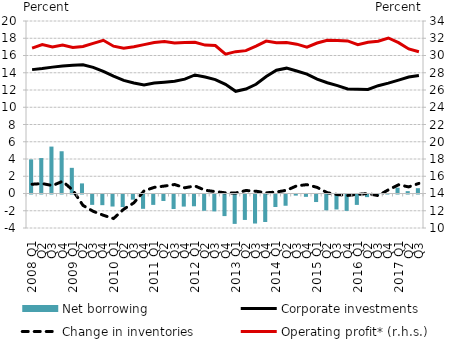
| Category | Net borrowing |
|---|---|
| 2008 Q1 | 3.953 |
| Q2 | 4.111 |
| Q3 | 5.439 |
| Q4 | 4.897 |
| 2009 Q1 | 2.976 |
| Q2 | 1.172 |
| Q3 | -1.202 |
| Q4 | -1.236 |
| 2010 Q1 | -1.395 |
| Q2 | -1.45 |
| Q3 | -0.599 |
| Q4 | -1.66 |
| 2011 Q1 | -1.204 |
| Q2 | -0.75 |
| Q3 | -1.683 |
| Q4 | -1.401 |
| 2012 Q1 | -1.365 |
| Q2 | -1.886 |
| Q3 | -1.959 |
| Q4 | -2.504 |
| 2013 Q1 | -3.407 |
| Q2 | -2.95 |
| Q3 | -3.365 |
| Q4 | -3.188 |
| 2014 Q1 | -1.447 |
| Q2 | -1.304 |
| Q3 | -0.127 |
| Q4 | -0.272 |
| 2015 Q1 | -0.874 |
| Q2 | -1.835 |
| Q3 | -1.736 |
| Q4 | -1.898 |
| 2016 Q1 | -1.205 |
| Q2 | -0.304 |
| Q3 | -0.099 |
| Q4 | 0.056 |
| 2017 Q1 | 0.673 |
| Q2 | 0.271 |
| Q3 | 0.615 |